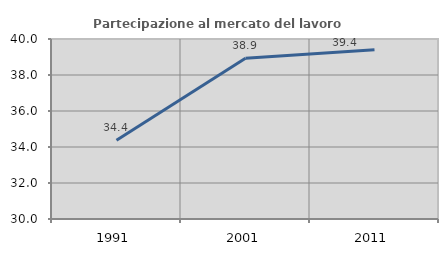
| Category | Partecipazione al mercato del lavoro  femminile |
|---|---|
| 1991.0 | 34.378 |
| 2001.0 | 38.931 |
| 2011.0 | 39.401 |